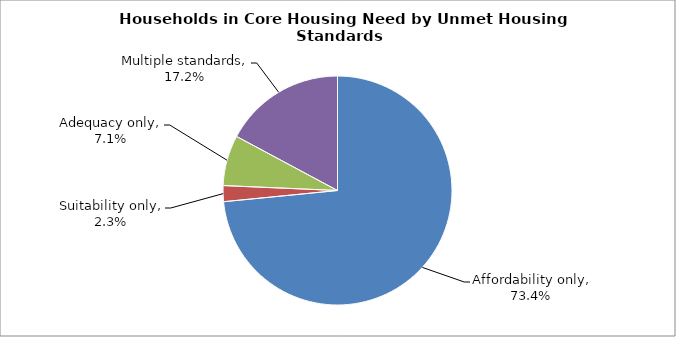
| Category | Series 0 |
|---|---|
| Affordability only | 0.734 |
| Suitability only | 0.023 |
| Adequacy only | 0.071 |
| Multiple standards | 0.172 |